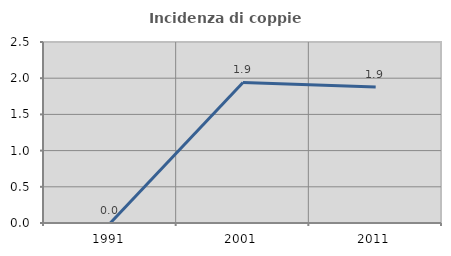
| Category | Incidenza di coppie miste |
|---|---|
| 1991.0 | 0 |
| 2001.0 | 1.942 |
| 2011.0 | 1.878 |